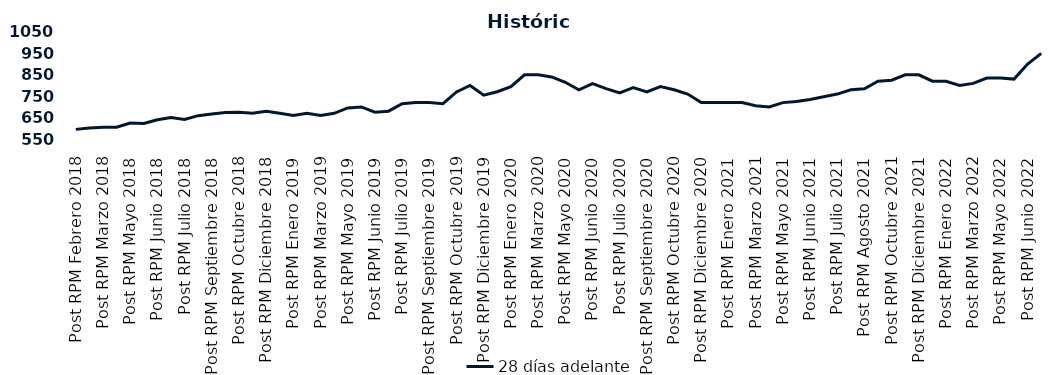
| Category | 28 días adelante |
|---|---|
| Post RPM Febrero 2018 | 595 |
| Pre RPM Marzo 2018 | 601 |
| Post RPM Marzo 2018 | 605 |
| Pre RPM Mayo 2018 | 605 |
| Post RPM Mayo 2018 | 625 |
| Pre RPM Junio 2018 | 623 |
| Post RPM Junio 2018 | 640 |
| Pre RPM Julio 2018 | 650 |
| Post RPM Julio 2018 | 641 |
| Pre RPM Septiembre 2018 | 659 |
| Post RPM Septiembre 2018 | 666.75 |
| Pre RPM Octubre 2018 | 674 |
| Post RPM Octubre 2018 | 675 |
| Pre RPM Diciembre 2018 | 670 |
| Post RPM Diciembre 2018 | 680 |
| Pre RPM Enero 2019 | 670 |
| Post RPM Enero 2019 | 660 |
| Pre RPM Marzo 2019 | 670 |
| Post RPM Marzo 2019 | 660 |
| Pre RPM Mayo 2019 | 670 |
| Post RPM Mayo 2019 | 695 |
| Pre RPM Junio 2019 | 700 |
| Post RPM Junio 2019 | 675 |
| Pre RPM Julio 2019 | 680 |
| Post RPM Julio 2019 | 715 |
| Pre RPM Septiembre 2019 | 720 |
| Post RPM Septiembre 2019 | 720 |
| Pre RPM Octubre 2019 | 715 |
| Post RPM Octubre 2019 | 770 |
| Pre RPM Diciembre 2019 | 800 |
| Post RPM Diciembre 2019 | 755 |
| Pre RPM Enero 2020 | 771 |
| Post RPM Enero 2020 | 795 |
| Pre RPM Marzo 2020 | 850 |
| Post RPM Marzo 2020 | 850 |
| Pre RPM Mayo 2020 | 840 |
| Post RPM Mayo 2020 | 815 |
| Pre RPM Junio 2020 | 780 |
| Post RPM Junio 2020 | 809 |
| Pre RPM Julio 2020 | 785.72 |
| Post RPM Julio 2020 | 765 |
| Pre RPM Septiembre 2020 | 790 |
| Post RPM Septiembre 2020 | 770 |
| Pre RPM Octubre 2020 | 795 |
| Post RPM Octubre 2020 | 780 |
| Pre RPM Diciembre 2020 | 760 |
| Post RPM Diciembre 2020 | 720 |
| Pre RPM Enero 2021 | 720 |
| Post RPM Enero 2021 | 720 |
| Pre RPM Marzo 2021 | 720 |
| Post RPM Marzo 2021 | 705 |
| Pre RPM Mayo 2021 | 700 |
| Post RPM Mayo 2021 | 720 |
| Pre RPM Junio 2021 | 725 |
| Post RPM Junio 2021 | 735 |
| Pre RPM Julio 2021 | 747.5 |
| Post RPM Julio 2021 | 760 |
| Pre RPM Agosto 2021 | 780 |
| Post RPM Agosto 2021 | 785 |
| Pre RPM Octubre 2021 | 820 |
| Post RPM Octubre 2021 | 825 |
| Pre RPM Diciembre 2021 | 850 |
| Post RPM Diciembre 2021 | 850 |
| Pre RPM Enero 2022 | 820 |
| Post RPM Enero 2022 | 820 |
| Pre RPM Marzo 2022 | 800 |
| Post RPM Marzo 2022 | 810 |
| Pre RPM Mayo 2022 | 835 |
| Post RPM Mayo 2022 | 835 |
| Pre RPM Junio 2022 | 830 |
| Post RPM Junio 2022 | 900 |
| Pre RPM Julio 2022 | 950 |